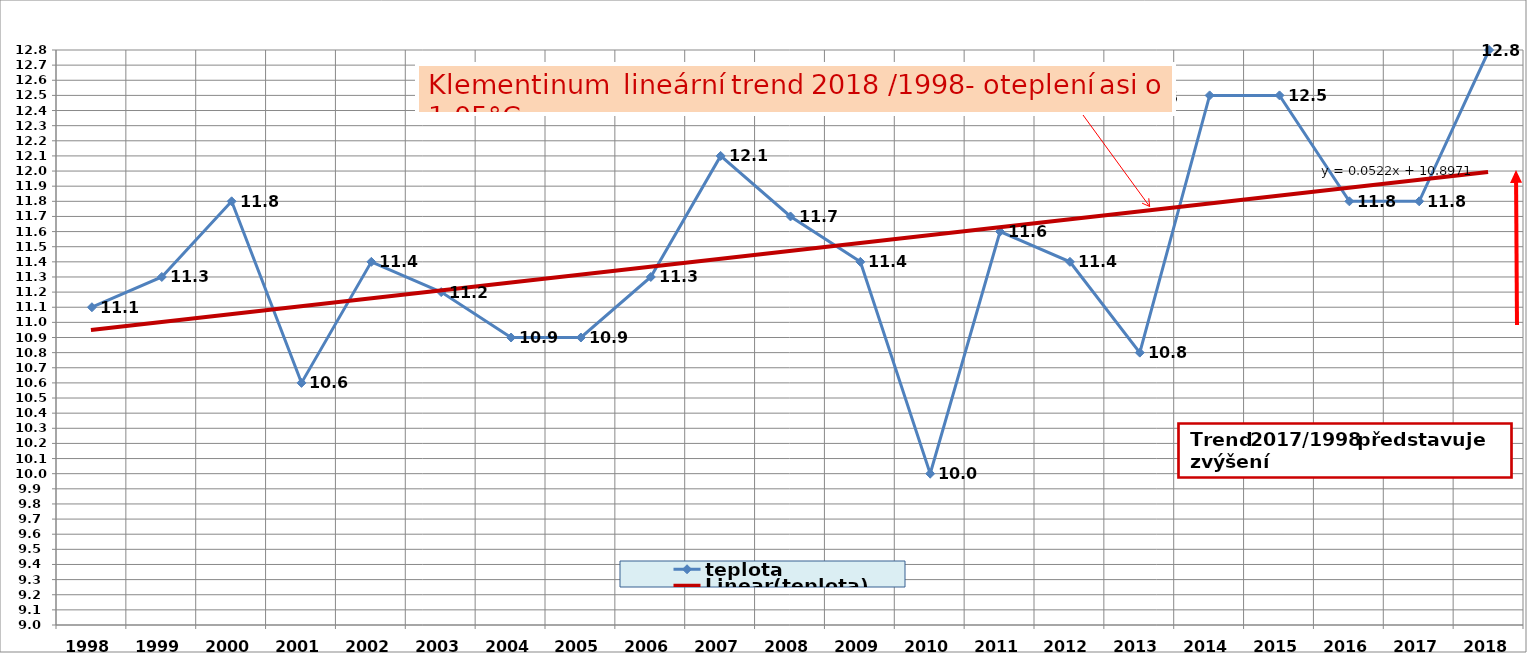
| Category | teplota |
|---|---|
| 1998 | 11.1 |
| 1999 | 11.3 |
| 2000 | 11.8 |
| 2001 | 10.6 |
| 2002 | 11.4 |
| 2003 | 11.2 |
| 2004 | 10.9 |
| 2005 | 10.9 |
| 2006 | 11.3 |
| 2007 | 12.1 |
| 2008 | 11.7 |
| 2009 | 11.4 |
| 2010 | 10 |
| 2011 | 11.6 |
| 2012 | 11.4 |
| 2013 | 10.8 |
| 2014 | 12.5 |
| 2015 | 12.5 |
| 2016 | 11.8 |
| 2017 | 11.8 |
| 2018 | 12.8 |